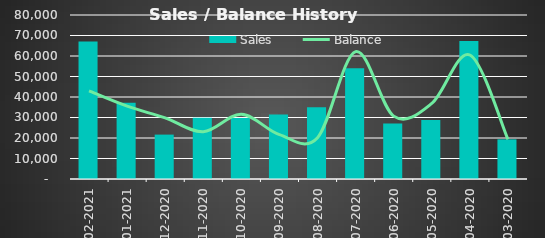
| Category |  Sales  |
|---|---|
| 2021-02-28 | 67057 |
| 2021-01-31 | 37200 |
| 2020-12-31 | 21658 |
| 2020-11-30 | 29900 |
| 2020-10-31 | 29780 |
| 2020-09-30 | 31500 |
| 2020-08-31 | 35000 |
| 2020-07-31 | 54000 |
| 2020-06-30 | 27020 |
| 2020-05-31 | 28720 |
| 2020-04-30 | 67338 |
| 2020-03-31 | 19350 |